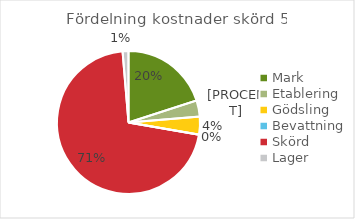
| Category | kr/kg ts |
|---|---|
| Mark | 0.833 |
| Etablering | 0.153 |
| Gödsling | 0.168 |
| Bevattning | 0 |
| Skörd | 2.954 |
| Lager | 0.056 |